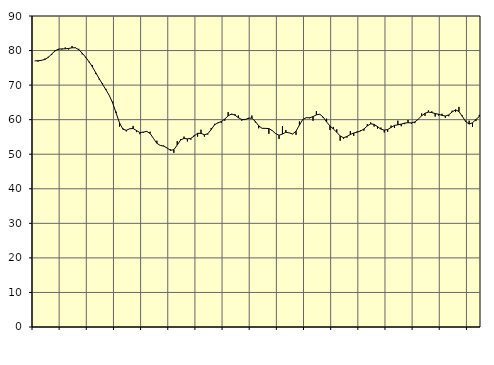
| Category | Piggar | Series 1 |
|---|---|---|
| nan | 77 | 77.01 |
| 87.0 | 76.8 | 77.05 |
| 87.0 | 77.1 | 77.18 |
| 87.0 | 77.7 | 77.41 |
| nan | 78.2 | 78.04 |
| 88.0 | 78.7 | 78.99 |
| 88.0 | 80.1 | 79.9 |
| 88.0 | 80.2 | 80.42 |
| nan | 80.3 | 80.49 |
| 89.0 | 80.9 | 80.5 |
| 89.0 | 80.3 | 80.61 |
| 89.0 | 81.3 | 80.8 |
| nan | 80.9 | 80.8 |
| 90.0 | 80.5 | 80.25 |
| 90.0 | 78.9 | 79.25 |
| 90.0 | 77.9 | 78.09 |
| nan | 76.6 | 76.79 |
| 91.0 | 75.8 | 75.27 |
| 91.0 | 73.2 | 73.56 |
| 91.0 | 71.6 | 71.87 |
| nan | 70.5 | 70.22 |
| 92.0 | 68.9 | 68.61 |
| 92.0 | 67 | 66.95 |
| 92.0 | 65.2 | 64.77 |
| nan | 62.3 | 61.89 |
| 93.0 | 58 | 59.05 |
| 93.0 | 57.5 | 57.22 |
| 93.0 | 56.6 | 56.93 |
| nan | 57.4 | 57.37 |
| 94.0 | 58.2 | 57.44 |
| 94.0 | 56.4 | 56.85 |
| 94.0 | 55.8 | 56.27 |
| nan | 56.2 | 56.4 |
| 95.0 | 56.5 | 56.61 |
| 95.0 | 56.5 | 56.01 |
| 95.0 | 54.6 | 54.56 |
| nan | 53.9 | 53.17 |
| 96.0 | 52.5 | 52.55 |
| 96.0 | 52.5 | 52.34 |
| 96.0 | 51.8 | 51.81 |
| nan | 51.4 | 51.13 |
| 97.0 | 50.4 | 51.31 |
| 97.0 | 53.8 | 52.66 |
| 97.0 | 54.4 | 54.11 |
| nan | 55.1 | 54.59 |
| 98.0 | 53.7 | 54.44 |
| 98.0 | 54.2 | 54.58 |
| 98.0 | 55.5 | 55.27 |
| nan | 55.1 | 56.06 |
| 99.0 | 57.1 | 56.03 |
| 99.0 | 55.1 | 55.64 |
| 99.0 | 55.7 | 55.92 |
| nan | 57.6 | 57.13 |
| 0.0 | 58.8 | 58.52 |
| 0.0 | 59 | 59.09 |
| 0.0 | 59.1 | 59.46 |
| nan | 59.7 | 60.18 |
| 1.0 | 62.2 | 61.11 |
| 1.0 | 61.5 | 61.64 |
| 1.0 | 61.6 | 61.3 |
| nan | 61.2 | 60.58 |
| 2.0 | 59.7 | 60.04 |
| 2.0 | 60.2 | 60 |
| 2.0 | 60.3 | 60.44 |
| nan | 61.2 | 60.44 |
| 3.0 | 59.2 | 59.51 |
| 3.0 | 57.5 | 58.22 |
| 3.0 | 57.5 | 57.49 |
| nan | 57.4 | 57.48 |
| 4.0 | 55.9 | 57.42 |
| 4.0 | 56.9 | 56.83 |
| 4.0 | 56 | 55.95 |
| nan | 54.4 | 55.49 |
| 5.0 | 58.1 | 55.84 |
| 5.0 | 57 | 56.36 |
| 5.0 | 56.2 | 56.16 |
| nan | 55.8 | 55.86 |
| 6.0 | 55.6 | 56.66 |
| 6.0 | 59.5 | 58.44 |
| 6.0 | 60 | 60.06 |
| nan | 60.6 | 60.56 |
| 7.0 | 60.4 | 60.55 |
| 7.0 | 59.7 | 60.88 |
| 7.0 | 62.5 | 61.4 |
| nan | 61.5 | 61.57 |
| 8.0 | 60.5 | 60.75 |
| 8.0 | 60.3 | 59.36 |
| 8.0 | 57 | 58.18 |
| nan | 57.9 | 57.31 |
| 9.0 | 57.2 | 56.37 |
| 9.0 | 53.9 | 55.28 |
| 9.0 | 54.4 | 54.77 |
| nan | 54.8 | 55.13 |
| 10.0 | 56.7 | 55.7 |
| 10.0 | 55.3 | 56.14 |
| 10.0 | 56.6 | 56.39 |
| nan | 56.9 | 56.72 |
| 11.0 | 56.8 | 57.3 |
| 11.0 | 58.7 | 58.18 |
| 11.0 | 59.2 | 58.8 |
| nan | 58 | 58.63 |
| 12.0 | 57.4 | 57.98 |
| 12.0 | 57.7 | 57.27 |
| 12.0 | 56.3 | 56.97 |
| nan | 56.5 | 57.14 |
| 13.0 | 58.3 | 57.76 |
| 13.0 | 57.6 | 58.34 |
| 13.0 | 59.7 | 58.51 |
| nan | 58.1 | 58.71 |
| 14.0 | 58.7 | 59 |
| 14.0 | 59.9 | 59.12 |
| 14.0 | 58.8 | 59.07 |
| nan | 59 | 59.34 |
| 15.0 | 60.1 | 60.14 |
| 15.0 | 61.8 | 61.11 |
| 15.0 | 61.1 | 61.85 |
| nan | 62.7 | 62.19 |
| 16.0 | 62.4 | 62.06 |
| 16.0 | 60.9 | 61.77 |
| 16.0 | 61.2 | 61.57 |
| nan | 61.7 | 61.26 |
| 17.0 | 60.5 | 61.05 |
| 17.0 | 61 | 61.38 |
| 17.0 | 62.6 | 62.23 |
| nan | 62.2 | 62.86 |
| 18.0 | 63.7 | 62.36 |
| 18.0 | 61.2 | 60.94 |
| 18.0 | 59.7 | 59.44 |
| nan | 59.7 | 58.73 |
| 19.0 | 57.9 | 59.1 |
| 19.0 | 59.6 | 60.04 |
| 19.0 | 61.4 | 60.92 |